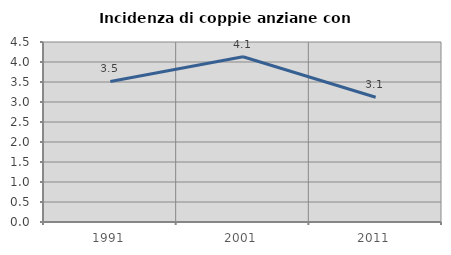
| Category | Incidenza di coppie anziane con figli |
|---|---|
| 1991.0 | 3.514 |
| 2001.0 | 4.131 |
| 2011.0 | 3.119 |